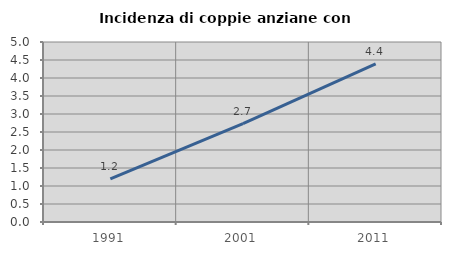
| Category | Incidenza di coppie anziane con figli |
|---|---|
| 1991.0 | 1.2 |
| 2001.0 | 2.732 |
| 2011.0 | 4.392 |